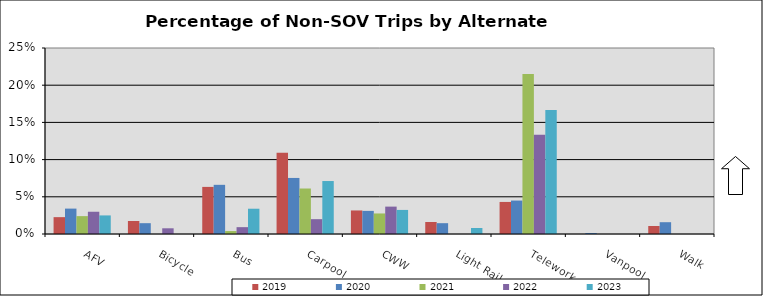
| Category | 2019 | 2020 | 2021 | 2022 | 2023 |
|---|---|---|---|---|---|
| AFV | 0.023 | 0.034 | 0.024 | 0.03 | 0.025 |
| Bicycle | 0.018 | 0.015 | 0 | 0.008 | 0 |
| Bus | 0.063 | 0.066 | 0.004 | 0.009 | 0.034 |
| Carpool | 0.109 | 0.075 | 0.061 | 0.02 | 0.071 |
| CWW | 0.032 | 0.031 | 0.028 | 0.037 | 0.032 |
| Light Rail | 0.016 | 0.015 | 0 | 0 | 0.008 |
| Telework | 0.043 | 0.045 | 0.215 | 0.133 | 0.167 |
| Vanpool | 0 | 0.001 | 0 | 0 | 0 |
| Walk | 0.011 | 0.016 | 0 | 0 | 0 |